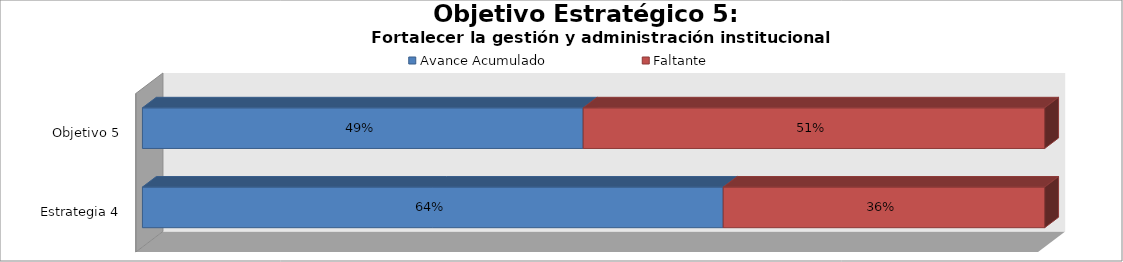
| Category | Avance Acumulado | Faltante |
|---|---|---|
| Estrategia 4 | 0.644 | 0.356 |
| Objetivo 5 | 0.489 | 0.511 |